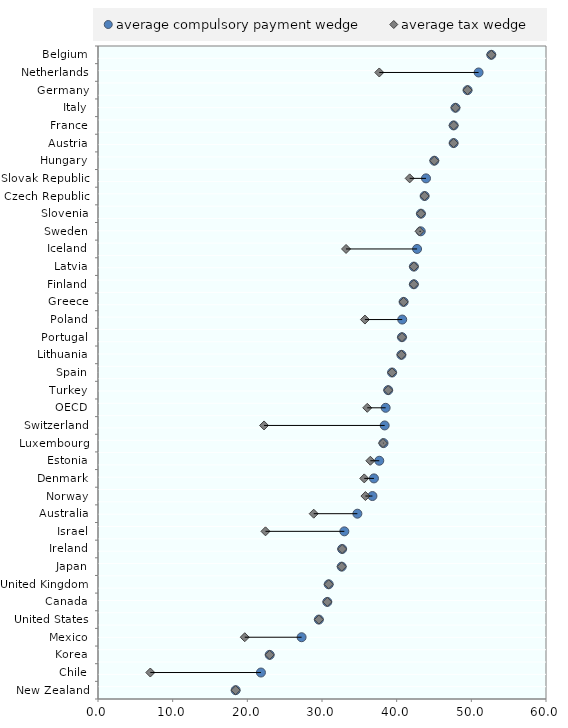
| Category | blankName |
|---|---|
| New Zealand | 18.436 |
| Chile | 7.008 |
| Korea | 22.993 |
| Mexico | 19.654 |
| United States | 29.581 |
| Canada | 30.712 |
| United Kingdom | 30.897 |
| Japan | 32.64 |
| Ireland | 32.7 |
| Israel | 22.431 |
| Australia | 28.889 |
| Norway | 35.815 |
| Denmark | 35.659 |
| Estonia | 36.475 |
| Luxembourg | 38.166 |
| Switzerland | 22.239 |
| OECD | 36.062 |
| Turkey | 38.865 |
| Spain | 39.384 |
| Lithuania | 40.634 |
| Portugal | 40.711 |
| Poland | 35.751 |
| Greece | 40.93 |
| Finland | 42.303 |
| Latvia | 42.31 |
| Iceland | 33.22 |
| Sweden | 43.063 |
| Slovenia | 43.251 |
| Czech Republic | 43.746 |
| Slovak Republic | 41.741 |
| Hungary | 45.041 |
| Austria | 47.629 |
| France | 47.633 |
| Italy | 47.877 |
| Germany | 49.496 |
| Netherlands | 37.673 |
| Belgium | 52.672 |